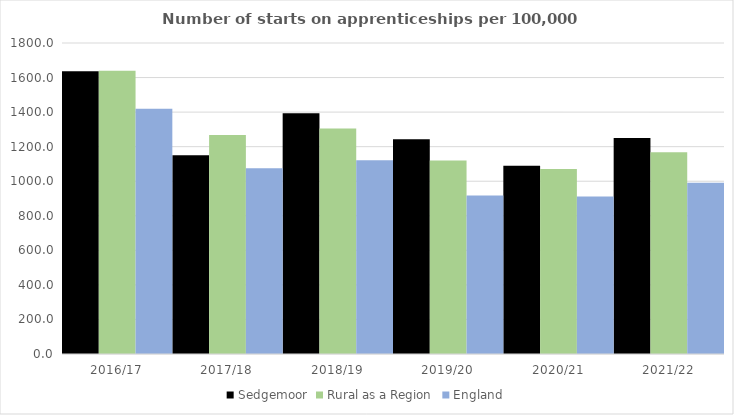
| Category | Sedgemoor | Rural as a Region | England |
|---|---|---|---|
| 2016/17 | 1637 | 1638.789 | 1420 |
| 2017/18 | 1151 | 1267.474 | 1075 |
| 2018/19 | 1393 | 1304.57 | 1122 |
| 2019/20 | 1243 | 1119.662 | 918 |
| 2020/21 | 1089 | 1070.748 | 912 |
| 2021/22 | 1250 | 1167.68 | 991 |